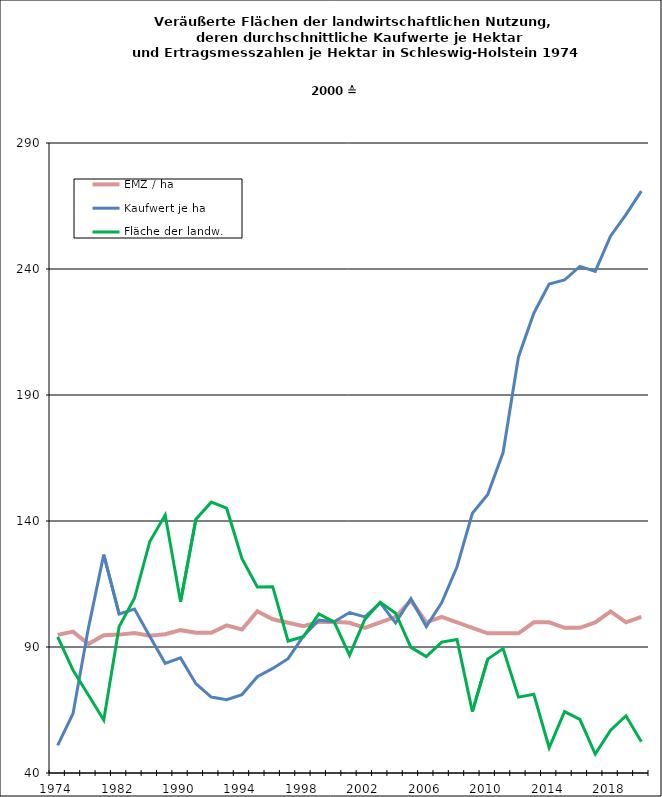
| Category | EMZ / ha | Kaufwert je ha | Fläche der landw. Nutzung |
|---|---|---|---|
| 1974.0 | 94.795 | 51 | 93.981 |
| 1976.0 | 96.097 | 63.639 | 80.798 |
| 1978.0 | 91.177 | 97.503 | 70.981 |
| 1980.0 | 94.702 | 126.649 | 61.017 |
| 1982.0 | 94.914 | 103.096 | 98.077 |
| 1984.0 | 95.527 | 105.048 | 109.324 |
| 1986.0 | 94.48 | 94.135 | 131.88 |
| 1988.0 | 95.081 | 83.528 | 142.385 |
| 1990.0 | 96.683 | 85.684 | 107.96 |
| 1991.0 | 95.675 | 75.423 | 140.67 |
| 1992.0 | 95.651 | 70.143 | 147.485 |
| 1993.0 | 98.57 | 69.101 | 145.071 |
| 1994.0 | 96.941 | 71.113 | 125.075 |
| 1995.0 | 104.16 | 78.2 | 113.839 |
| 1996.0 | 101.007 | 81.509 | 113.945 |
| 1997.0 | 99.604 | 85.367 | 92.368 |
| 1998.0 | 98.258 | 94.343 | 94.074 |
| 1999.0 | 99.97 | 100.651 | 103.111 |
| 2000.0 | 100 | 100 | 100 |
| 2001.0 | 99.588 | 103.657 | 86.753 |
| 2002.0 | 97.614 | 101.94 | 100.958 |
| 2003.0 | 99.783 | 107.499 | 107.763 |
| 2004.0 | 101.952 | 99.575 | 103.431 |
| 2005.0 | 108.46 | 109.153 | 89.843 |
| 2006.0 | 99.783 | 98.107 | 86.202 |
| 2007.0 | 101.952 | 107.508 | 91.94 |
| 2008.0 | 99.783 | 121.845 | 93.002 |
| 2009.0 | 97.614 | 143.056 | 64.336 |
| 2010.0 | 95.445 | 150.509 | 85.196 |
| 2011.0 | 95.445 | 167.176 | 89.386 |
| 2012.0 | 95.445 | 205.117 | 70.111 |
| 2013.0 | 99.783 | 222.46 | 71.215 |
| 2014.0 | 99.783 | 234.004 | 50.013 |
| 2015.0 | 97.614 | 235.632 | 64.355 |
| 2016.0 | 97.614 | 241.03 | 61.26 |
| 2017.0 | 99.783 | 239.02 | 47.529 |
| 2018.0 | 104.121 | 253.144 | 56.977 |
| 2019.0 | 99.783 | 261.575 | 62.709 |